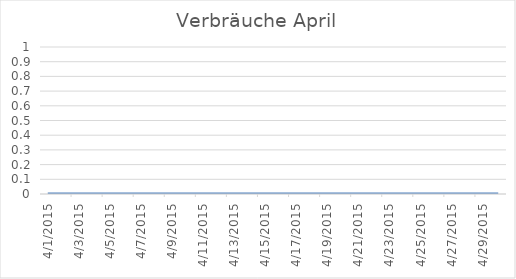
| Category | Series 0 |
|---|---|
| 01/04/2015 | 0 |
| 02/04/2015 | 0 |
| 03/04/2015 | 0 |
| 04/04/2015 | 0 |
| 05/04/2015 | 0 |
| 06/04/2015 | 0 |
| 07/04/2015 | 0 |
| 08/04/2015 | 0 |
| 09/04/2015 | 0 |
| 10/04/2015 | 0 |
| 11/04/2015 | 0 |
| 12/04/2015 | 0 |
| 13/04/2015 | 0 |
| 14/04/2015 | 0 |
| 15/04/2015 | 0 |
| 16/04/2015 | 0 |
| 17/04/2015 | 0 |
| 18/04/2015 | 0 |
| 19/04/2015 | 0 |
| 20/04/2015 | 0 |
| 21/04/2015 | 0 |
| 22/04/2015 | 0 |
| 23/04/2015 | 0 |
| 24/04/2015 | 0 |
| 25/04/2015 | 0 |
| 26/04/2015 | 0 |
| 27/04/2015 | 0 |
| 28/04/2015 | 0 |
| 29/04/2015 | 0 |
| 30/04/2015 | 0 |